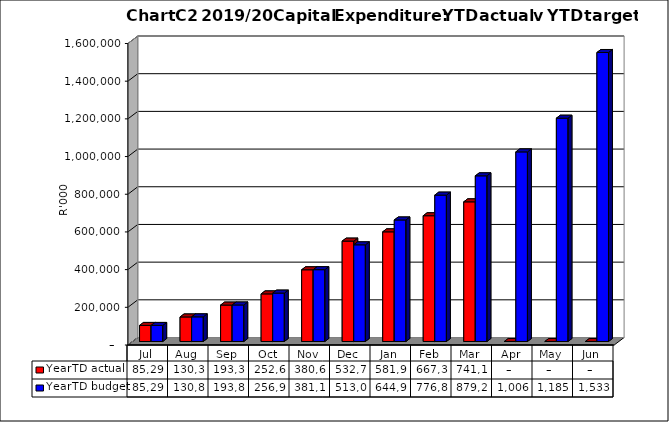
| Category | YearTD actual | YearTD budget |
|---|---|---|
| Jul | 85297669.118 | 85297669.12 |
| Aug | 130318368.104 | 130812960.887 |
| Sep | 193342852.712 | 193837445.496 |
| Oct | 252692320.524 | 256905748.808 |
| Nov | 380658881.887 | 381153474.478 |
| Dec | 532797066.677 | 513021474.478 |
| Jan | 581917239.949 | 644959474.478 |
| Feb | 667395468.141 | 776897474.478 |
| Mar | 741132739.145 | 879206464.478 |
| Apr | 0 | 1006197464.478 |
| May | 0 | 1185005464.478 |
| Jun | 0 | 1533659102 |